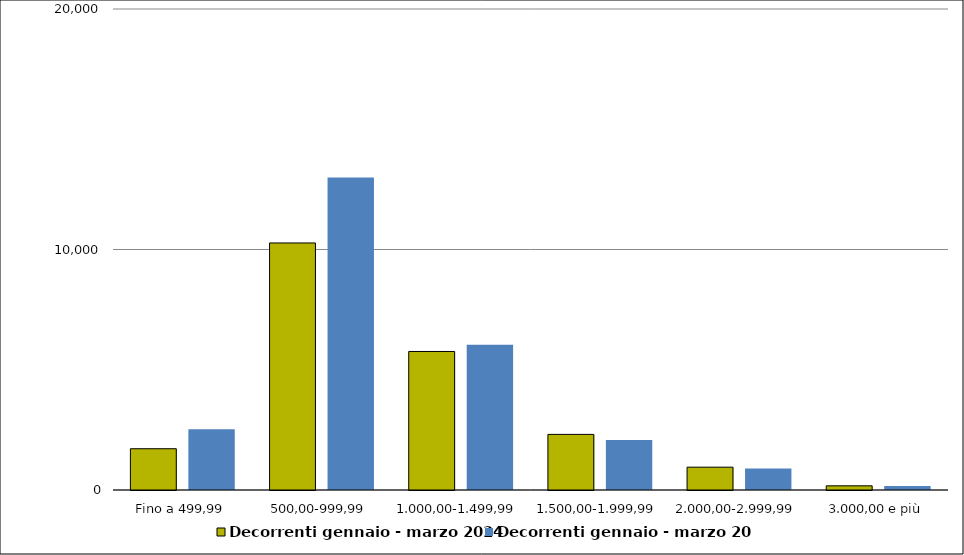
| Category | Decorrenti gennaio - marzo 2024 | Decorrenti gennaio - marzo 2023 |
|---|---|---|
|  Fino a 499,99  | 1716 | 2524 |
|  500,00-999,99  | 10272 | 12995 |
|  1.000,00-1.499,99  | 5760 | 6041 |
|  1.500,00-1.999,99  | 2312 | 2081 |
|  2.000,00-2.999,99  | 949 | 894 |
|  3.000,00 e più  | 173 | 168 |